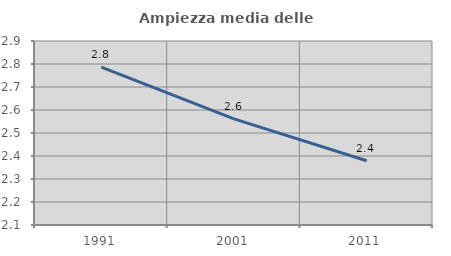
| Category | Ampiezza media delle famiglie |
|---|---|
| 1991.0 | 2.787 |
| 2001.0 | 2.562 |
| 2011.0 | 2.379 |